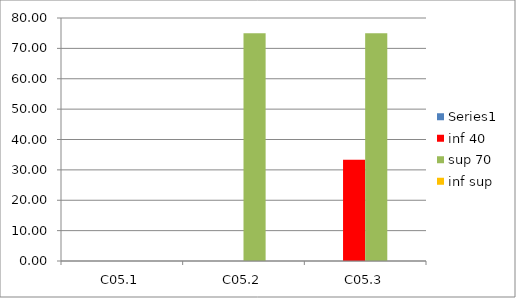
| Category | Series 0 | inf 40 | sup 70 | inf sup |
|---|---|---|---|---|
| C05.1 | 22.222 | 0 | 0 | 0 |
| C05.2 | 75 | 0 | 75 | 0 |
| C05.3 | 33.333 | 33.333 | 75 | 0 |